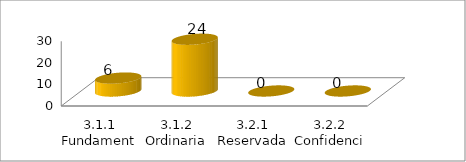
| Category | Series 0 |
|---|---|
| 3.1.1 Fundamental | 6 |
| 3.1.2 Ordinaria | 24 |
| 3.2.1 Reservada | 0 |
| 3.2.2 Confidencial | 0 |